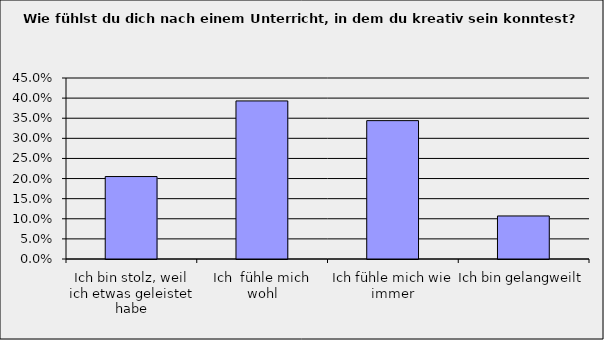
| Category | Series 0 |
|---|---|
| Ich bin stolz, weil ich etwas geleistet habe | 0.205 |
| Ich  fühle mich wohl | 0.393 |
| Ich fühle mich wie immer | 0.344 |
| Ich bin gelangweilt | 0.107 |